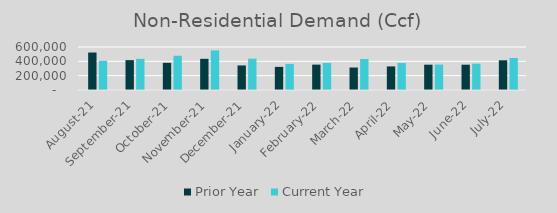
| Category | Prior Year | Current Year |
|---|---|---|
| 2021-08-01 | 522963.473 | 407774.995 |
| 2021-09-01 | 416886.629 | 434192.442 |
| 2021-10-01 | 379515 | 477878.526 |
| 2021-11-01 | 434815 | 552599.698 |
| 2021-12-01 | 342584.594 | 436956.784 |
| 2022-01-01 | 322657.16 | 364164.019 |
| 2022-02-01 | 354041 | 377149.369 |
| 2022-03-01 | 313343 | 432270.798 |
| 2022-04-01 | 329084.722 | 376255.784 |
| 2022-05-01 | 353085 | 354792 |
| 2022-06-01 | 353141.442 | 367009.666 |
| 2022-07-01 | 414577.112 | 446288 |